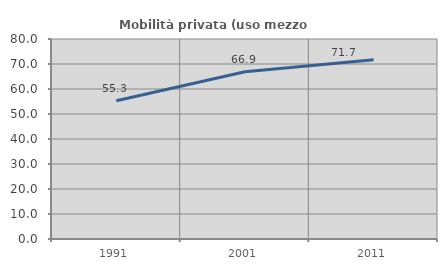
| Category | Mobilità privata (uso mezzo privato) |
|---|---|
| 1991.0 | 55.331 |
| 2001.0 | 66.871 |
| 2011.0 | 71.686 |